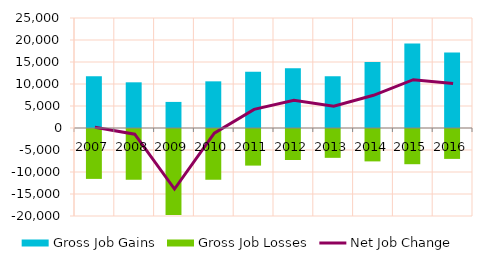
| Category | Gross Job Gains | Gross Job Losses |
|---|---|---|
| 2007.0 | 11747 | -11566 |
| 2008.0 | 10383 | -11784 |
| 2009.0 | 5928 | -19795 |
| 2010.0 | 10605 | -11777 |
| 2011.0 | 12777 | -8546 |
| 2012.0 | 13562 | -7273 |
| 2013.0 | 11735 | -6782 |
| 2014.0 | 15023 | -7589 |
| 2015.0 | 19216 | -8230 |
| 2016.0 | 17142 | -7021 |